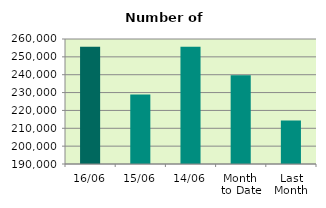
| Category | Series 0 |
|---|---|
| 16/06 | 255720 |
| 15/06 | 228966 |
| 14/06 | 255608 |
| Month 
to Date | 239687.833 |
| Last
Month | 214383.182 |